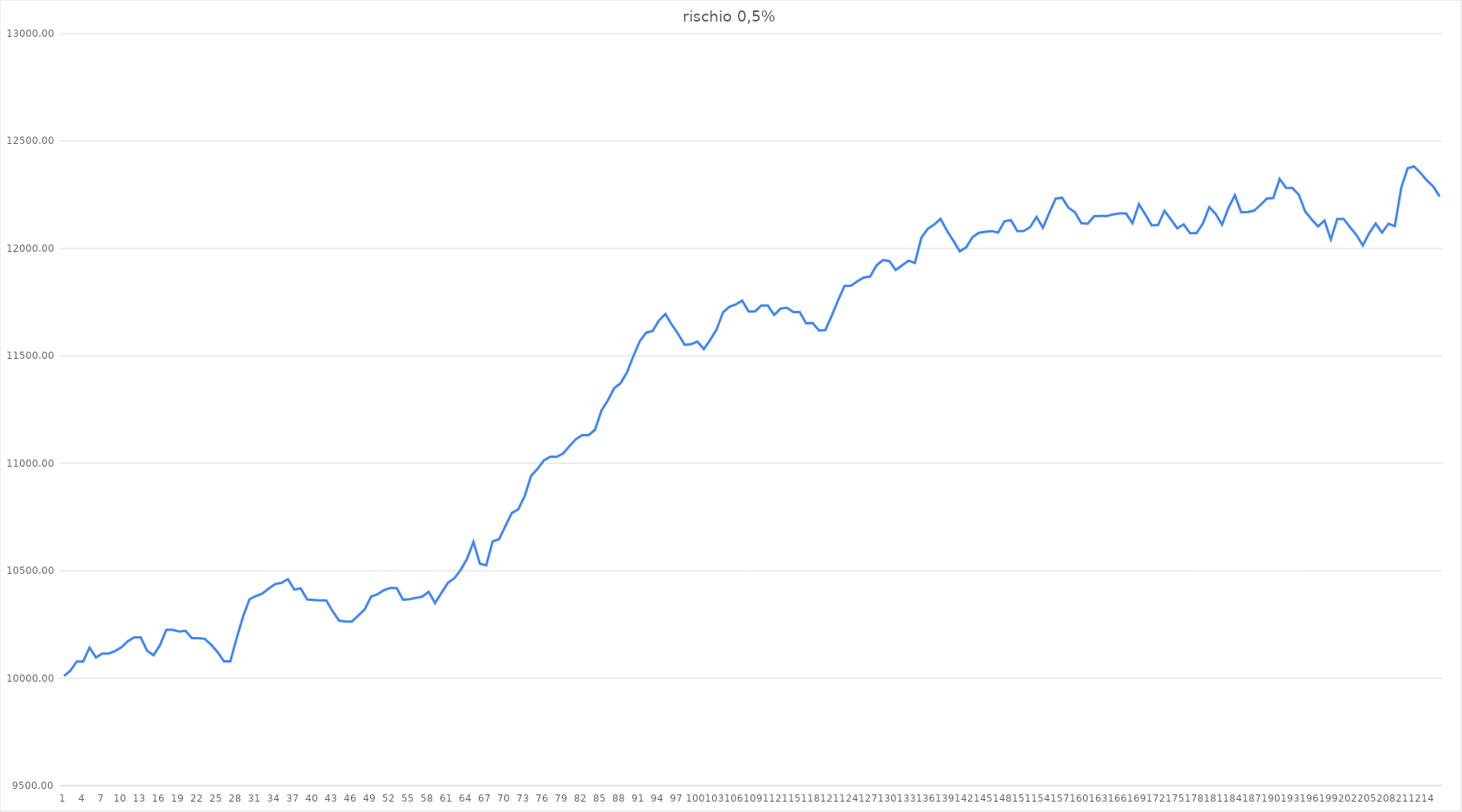
| Category | Series 0 |
|---|---|
| 0 | 10010 |
| 1 | 10034.64 |
| 2 | 10077.76 |
| 3 | 10077.76 |
| 4 | 10142.5 |
| 5 | 10096.42 |
| 6 | 10115.02 |
| 7 | 10115.02 |
| 8 | 10126.22 |
| 9 | 10144.46 |
| 10 | 10172.51 |
| 11 | 10189.87 |
| 12 | 10189.87 |
| 13 | 10128.046 |
| 14 | 10107.116 |
| 15 | 10152.996 |
| 16 | 10225.206 |
| 17 | 10225.206 |
| 18 | 10217.206 |
| 19 | 10220.406 |
| 20 | 10186.246 |
| 21 | 10186.246 |
| 22 | 10182.966 |
| 23 | 10155.996 |
| 24 | 10122.516 |
| 25 | 10078.036 |
| 26 | 10078.036 |
| 27 | 10186.836 |
| 28 | 10287.636 |
| 29 | 10367.636 |
| 30 | 10382.036 |
| 31 | 10394.276 |
| 32 | 10417.061 |
| 33 | 10437.986 |
| 34 | 10443.866 |
| 35 | 10460.792 |
| 36 | 10412.576 |
| 37 | 10417.696 |
| 38 | 10366.496 |
| 39 | 10364.096 |
| 40 | 10361.936 |
| 41 | 10361.936 |
| 42 | 10311.221 |
| 43 | 10268.061 |
| 44 | 10263.261 |
| 45 | 10263.261 |
| 46 | 10292.037 |
| 47 | 10319.505 |
| 48 | 10379.505 |
| 49 | 10390.305 |
| 50 | 10409.493 |
| 51 | 10419.828 |
| 52 | 10419.828 |
| 53 | 10365.428 |
| 54 | 10367.42 |
| 55 | 10373.66 |
| 56 | 10379.66 |
| 57 | 10402.16 |
| 58 | 10349.68 |
| 59 | 10397 |
| 60 | 10443.475 |
| 61 | 10464.475 |
| 62 | 10504.075 |
| 63 | 10555.075 |
| 64 | 10634.805 |
| 65 | 10533.13 |
| 66 | 10524.83 |
| 67 | 10636.385 |
| 68 | 10646.465 |
| 69 | 10708.105 |
| 70 | 10768.585 |
| 71 | 10786.225 |
| 72 | 10846.705 |
| 73 | 10940.785 |
| 74 | 10973.545 |
| 75 | 11013.481 |
| 76 | 11030.633 |
| 77 | 11030.633 |
| 78 | 11045.508 |
| 79 | 11080.018 |
| 80 | 11112.05 |
| 81 | 11131.078 |
| 82 | 11131.078 |
| 83 | 11156.002 |
| 84 | 11244.442 |
| 85 | 11293.082 |
| 86 | 11349.402 |
| 87 | 11373.162 |
| 88 | 11423.562 |
| 89 | 11499.162 |
| 90 | 11568.162 |
| 91 | 11608.282 |
| 92 | 11615.362 |
| 93 | 11664.862 |
| 94 | 11694.598 |
| 95 | 11645.198 |
| 96 | 11601.638 |
| 97 | 11551.838 |
| 98 | 11553.638 |
| 99 | 11566.918 |
| 100 | 11531.518 |
| 101 | 11573.998 |
| 102 | 11622.304 |
| 103 | 11702.704 |
| 104 | 11728.304 |
| 105 | 11739.056 |
| 106 | 11757.056 |
| 107 | 11706.668 |
| 108 | 11706.668 |
| 109 | 11734.843 |
| 110 | 11734.843 |
| 111 | 11690.563 |
| 112 | 11720.083 |
| 113 | 11724.163 |
| 114 | 11703.779 |
| 115 | 11703.779 |
| 116 | 11651.279 |
| 117 | 11653.709 |
| 118 | 11618.069 |
| 119 | 11620.256 |
| 120 | 11687.456 |
| 121 | 11759.481 |
| 122 | 11825.631 |
| 123 | 11826.175 |
| 124 | 11846.643 |
| 125 | 11864.787 |
| 126 | 11868.963 |
| 127 | 11921.379 |
| 128 | 11945.739 |
| 129 | 11941.019 |
| 130 | 11899.719 |
| 131 | 11921.223 |
| 132 | 11943.111 |
| 133 | 11932.056 |
| 134 | 12049.816 |
| 135 | 12091.216 |
| 136 | 12110.62 |
| 137 | 12137.185 |
| 138 | 12083.285 |
| 139 | 12036.095 |
| 140 | 11986.815 |
| 141 | 12004.635 |
| 142 | 12052.485 |
| 143 | 12072.89 |
| 144 | 12077.49 |
| 145 | 12080.735 |
| 146 | 12073.559 |
| 147 | 12126.794 |
| 148 | 12131.799 |
| 149 | 12080.279 |
| 150 | 12081.434 |
| 151 | 12099.193 |
| 152 | 12146.653 |
| 153 | 12096.064 |
| 154 | 12166.134 |
| 155 | 12232.354 |
| 156 | 12236.034 |
| 157 | 12188.994 |
| 158 | 12168.894 |
| 159 | 12117.374 |
| 160 | 12115.142 |
| 161 | 12149.792 |
| 162 | 12150.611 |
| 163 | 12150.611 |
| 164 | 12158.771 |
| 165 | 12162.851 |
| 166 | 12162.851 |
| 167 | 12116.861 |
| 168 | 12206.069 |
| 169 | 12158.741 |
| 170 | 12107.391 |
| 171 | 12108.971 |
| 172 | 12175.391 |
| 173 | 12135.164 |
| 174 | 12093.564 |
| 175 | 12111.864 |
| 176 | 12070.824 |
| 177 | 12070.824 |
| 178 | 12115.336 |
| 179 | 12191.841 |
| 180 | 12160.485 |
| 181 | 12110.925 |
| 182 | 12188.685 |
| 183 | 12247.885 |
| 184 | 12168.361 |
| 185 | 12169.849 |
| 186 | 12175.789 |
| 187 | 12202.167 |
| 188 | 12231.845 |
| 189 | 12234.41 |
| 190 | 12323.33 |
| 191 | 12282.202 |
| 192 | 12281.146 |
| 193 | 12249.646 |
| 194 | 12171.438 |
| 195 | 12134.988 |
| 196 | 12102.648 |
| 197 | 12130.098 |
| 198 | 12041.604 |
| 199 | 12137.514 |
| 200 | 12137.514 |
| 201 | 12099.034 |
| 202 | 12062.536 |
| 203 | 12013.288 |
| 204 | 12071.368 |
| 205 | 12116.385 |
| 206 | 12073.225 |
| 207 | 12114.985 |
| 208 | 12103.645 |
| 209 | 12281.86 |
| 210 | 12373.036 |
| 211 | 12381.868 |
| 212 | 12352.108 |
| 213 | 12316.908 |
| 214 | 12288.684 |
| 215 | 12241.868 |